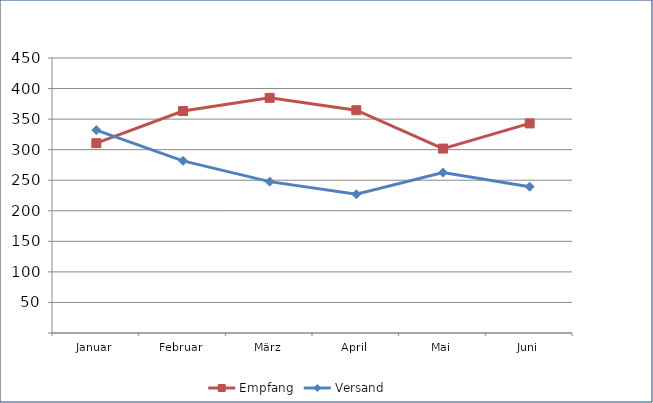
| Category | Empfang | Versand |
|---|---|---|
| Januar | 310.571 | 332.035 |
| Februar | 363.206 | 281.712 |
| März | 384.776 | 247.712 |
| April | 364.536 | 226.939 |
| Mai | 301.799 | 262.456 |
| Juni | 343.01 | 239.434 |